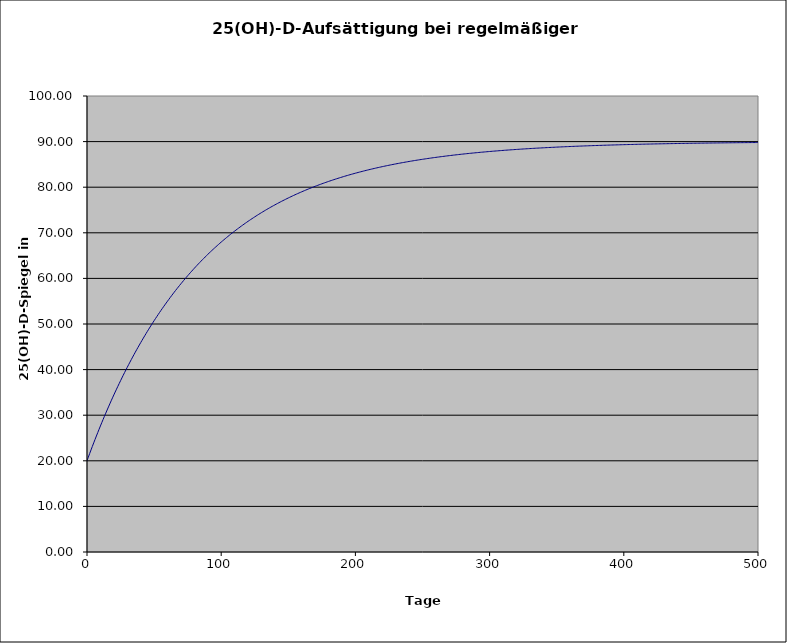
| Category | Series 0 |
|---|---|
| 0.0 | 20 |
| 1.0 | 20.804 |
| 2.0 | 21.599 |
| 3.0 | 22.385 |
| 4.0 | 23.162 |
| 5.0 | 23.93 |
| 6.0 | 24.689 |
| 7.0 | 25.439 |
| 8.0 | 26.181 |
| 9.0 | 26.914 |
| 10.0 | 27.639 |
| 11.0 | 28.355 |
| 12.0 | 29.064 |
| 13.0 | 29.764 |
| 14.0 | 30.456 |
| 15.0 | 31.14 |
| 16.0 | 31.816 |
| 17.0 | 32.485 |
| 18.0 | 33.145 |
| 19.0 | 33.799 |
| 20.0 | 34.444 |
| 21.0 | 35.083 |
| 22.0 | 35.714 |
| 23.0 | 36.337 |
| 24.0 | 36.954 |
| 25.0 | 37.563 |
| 26.0 | 38.166 |
| 27.0 | 38.761 |
| 28.0 | 39.35 |
| 29.0 | 39.932 |
| 30.0 | 40.507 |
| 31.0 | 41.076 |
| 32.0 | 41.638 |
| 33.0 | 42.194 |
| 34.0 | 42.743 |
| 35.0 | 43.286 |
| 36.0 | 43.823 |
| 37.0 | 44.353 |
| 38.0 | 44.878 |
| 39.0 | 45.396 |
| 40.0 | 45.909 |
| 41.0 | 46.416 |
| 42.0 | 46.916 |
| 43.0 | 47.411 |
| 44.0 | 47.901 |
| 45.0 | 48.385 |
| 46.0 | 48.863 |
| 47.0 | 49.335 |
| 48.0 | 49.803 |
| 49.0 | 50.265 |
| 50.0 | 50.721 |
| 51.0 | 51.173 |
| 52.0 | 51.619 |
| 53.0 | 52.06 |
| 54.0 | 52.496 |
| 55.0 | 52.927 |
| 56.0 | 53.353 |
| 57.0 | 53.774 |
| 58.0 | 54.19 |
| 59.0 | 54.602 |
| 60.0 | 55.008 |
| 61.0 | 55.41 |
| 62.0 | 55.808 |
| 63.0 | 56.201 |
| 64.0 | 56.589 |
| 65.0 | 56.973 |
| 66.0 | 57.353 |
| 67.0 | 57.728 |
| 68.0 | 58.099 |
| 69.0 | 58.465 |
| 70.0 | 58.828 |
| 71.0 | 59.186 |
| 72.0 | 59.54 |
| 73.0 | 59.89 |
| 74.0 | 60.236 |
| 75.0 | 60.578 |
| 76.0 | 60.916 |
| 77.0 | 61.251 |
| 78.0 | 61.581 |
| 79.0 | 61.908 |
| 80.0 | 62.231 |
| 81.0 | 62.55 |
| 82.0 | 62.865 |
| 83.0 | 63.177 |
| 84.0 | 63.485 |
| 85.0 | 63.79 |
| 86.0 | 64.091 |
| 87.0 | 64.389 |
| 88.0 | 64.683 |
| 89.0 | 64.974 |
| 90.0 | 65.262 |
| 91.0 | 65.546 |
| 92.0 | 65.827 |
| 93.0 | 66.105 |
| 94.0 | 66.38 |
| 95.0 | 66.651 |
| 96.0 | 66.92 |
| 97.0 | 67.185 |
| 98.0 | 67.447 |
| 99.0 | 67.707 |
| 100.0 | 67.963 |
| 101.0 | 68.216 |
| 102.0 | 68.467 |
| 103.0 | 68.714 |
| 104.0 | 68.959 |
| 105.0 | 69.201 |
| 106.0 | 69.44 |
| 107.0 | 69.676 |
| 108.0 | 69.91 |
| 109.0 | 70.141 |
| 110.0 | 70.369 |
| 111.0 | 70.595 |
| 112.0 | 70.818 |
| 113.0 | 71.038 |
| 114.0 | 71.256 |
| 115.0 | 71.472 |
| 116.0 | 71.685 |
| 117.0 | 71.895 |
| 118.0 | 72.103 |
| 119.0 | 72.309 |
| 120.0 | 72.513 |
| 121.0 | 72.714 |
| 122.0 | 72.912 |
| 123.0 | 73.109 |
| 124.0 | 73.303 |
| 125.0 | 73.495 |
| 126.0 | 73.685 |
| 127.0 | 73.872 |
| 128.0 | 74.058 |
| 129.0 | 74.241 |
| 130.0 | 74.422 |
| 131.0 | 74.601 |
| 132.0 | 74.778 |
| 133.0 | 74.953 |
| 134.0 | 75.126 |
| 135.0 | 75.298 |
| 136.0 | 75.467 |
| 137.0 | 75.634 |
| 138.0 | 75.799 |
| 139.0 | 75.962 |
| 140.0 | 76.124 |
| 141.0 | 76.283 |
| 142.0 | 76.441 |
| 143.0 | 76.597 |
| 144.0 | 76.751 |
| 145.0 | 76.903 |
| 146.0 | 77.054 |
| 147.0 | 77.203 |
| 148.0 | 77.35 |
| 149.0 | 77.496 |
| 150.0 | 77.639 |
| 151.0 | 77.782 |
| 152.0 | 77.922 |
| 153.0 | 78.061 |
| 154.0 | 78.198 |
| 155.0 | 78.334 |
| 156.0 | 78.468 |
| 157.0 | 78.601 |
| 158.0 | 78.732 |
| 159.0 | 78.862 |
| 160.0 | 78.99 |
| 161.0 | 79.116 |
| 162.0 | 79.242 |
| 163.0 | 79.365 |
| 164.0 | 79.488 |
| 165.0 | 79.609 |
| 166.0 | 79.728 |
| 167.0 | 79.846 |
| 168.0 | 79.963 |
| 169.0 | 80.079 |
| 170.0 | 80.193 |
| 171.0 | 80.306 |
| 172.0 | 80.417 |
| 173.0 | 80.527 |
| 174.0 | 80.636 |
| 175.0 | 80.744 |
| 176.0 | 80.851 |
| 177.0 | 80.956 |
| 178.0 | 81.06 |
| 179.0 | 81.163 |
| 180.0 | 81.265 |
| 181.0 | 81.365 |
| 182.0 | 81.465 |
| 183.0 | 81.563 |
| 184.0 | 81.66 |
| 185.0 | 81.756 |
| 186.0 | 81.851 |
| 187.0 | 81.945 |
| 188.0 | 82.037 |
| 189.0 | 82.129 |
| 190.0 | 82.219 |
| 191.0 | 82.309 |
| 192.0 | 82.398 |
| 193.0 | 82.485 |
| 194.0 | 82.572 |
| 195.0 | 82.657 |
| 196.0 | 82.742 |
| 197.0 | 82.825 |
| 198.0 | 82.908 |
| 199.0 | 82.989 |
| 200.0 | 83.07 |
| 201.0 | 83.15 |
| 202.0 | 83.229 |
| 203.0 | 83.307 |
| 204.0 | 83.384 |
| 205.0 | 83.46 |
| 206.0 | 83.535 |
| 207.0 | 83.61 |
| 208.0 | 83.683 |
| 209.0 | 83.756 |
| 210.0 | 83.828 |
| 211.0 | 83.899 |
| 212.0 | 83.969 |
| 213.0 | 84.039 |
| 214.0 | 84.108 |
| 215.0 | 84.175 |
| 216.0 | 84.242 |
| 217.0 | 84.309 |
| 218.0 | 84.374 |
| 219.0 | 84.439 |
| 220.0 | 84.503 |
| 221.0 | 84.567 |
| 222.0 | 84.629 |
| 223.0 | 84.691 |
| 224.0 | 84.752 |
| 225.0 | 84.813 |
| 226.0 | 84.872 |
| 227.0 | 84.932 |
| 228.0 | 84.99 |
| 229.0 | 85.048 |
| 230.0 | 85.105 |
| 231.0 | 85.161 |
| 232.0 | 85.217 |
| 233.0 | 85.272 |
| 234.0 | 85.327 |
| 235.0 | 85.38 |
| 236.0 | 85.434 |
| 237.0 | 85.486 |
| 238.0 | 85.538 |
| 239.0 | 85.59 |
| 240.0 | 85.641 |
| 241.0 | 85.691 |
| 242.0 | 85.741 |
| 243.0 | 85.79 |
| 244.0 | 85.838 |
| 245.0 | 85.886 |
| 246.0 | 85.934 |
| 247.0 | 85.981 |
| 248.0 | 86.027 |
| 249.0 | 86.073 |
| 250.0 | 86.118 |
| 251.0 | 86.163 |
| 252.0 | 86.207 |
| 253.0 | 86.251 |
| 254.0 | 86.294 |
| 255.0 | 86.337 |
| 256.0 | 86.379 |
| 257.0 | 86.421 |
| 258.0 | 86.462 |
| 259.0 | 86.503 |
| 260.0 | 86.543 |
| 261.0 | 86.583 |
| 262.0 | 86.623 |
| 263.0 | 86.662 |
| 264.0 | 86.7 |
| 265.0 | 86.738 |
| 266.0 | 86.776 |
| 267.0 | 86.813 |
| 268.0 | 86.85 |
| 269.0 | 86.886 |
| 270.0 | 86.922 |
| 271.0 | 86.958 |
| 272.0 | 86.993 |
| 273.0 | 87.028 |
| 274.0 | 87.062 |
| 275.0 | 87.096 |
| 276.0 | 87.13 |
| 277.0 | 87.163 |
| 278.0 | 87.196 |
| 279.0 | 87.228 |
| 280.0 | 87.26 |
| 281.0 | 87.292 |
| 282.0 | 87.323 |
| 283.0 | 87.354 |
| 284.0 | 87.384 |
| 285.0 | 87.415 |
| 286.0 | 87.445 |
| 287.0 | 87.474 |
| 288.0 | 87.503 |
| 289.0 | 87.532 |
| 290.0 | 87.561 |
| 291.0 | 87.589 |
| 292.0 | 87.617 |
| 293.0 | 87.644 |
| 294.0 | 87.672 |
| 295.0 | 87.699 |
| 296.0 | 87.725 |
| 297.0 | 87.752 |
| 298.0 | 87.778 |
| 299.0 | 87.803 |
| 300.0 | 87.829 |
| 301.0 | 87.854 |
| 302.0 | 87.879 |
| 303.0 | 87.903 |
| 304.0 | 87.928 |
| 305.0 | 87.952 |
| 306.0 | 87.975 |
| 307.0 | 87.999 |
| 308.0 | 88.022 |
| 309.0 | 88.045 |
| 310.0 | 88.067 |
| 311.0 | 88.09 |
| 312.0 | 88.112 |
| 313.0 | 88.134 |
| 314.0 | 88.155 |
| 315.0 | 88.177 |
| 316.0 | 88.198 |
| 317.0 | 88.219 |
| 318.0 | 88.239 |
| 319.0 | 88.26 |
| 320.0 | 88.28 |
| 321.0 | 88.3 |
| 322.0 | 88.32 |
| 323.0 | 88.339 |
| 324.0 | 88.359 |
| 325.0 | 88.378 |
| 326.0 | 88.396 |
| 327.0 | 88.415 |
| 328.0 | 88.433 |
| 329.0 | 88.452 |
| 330.0 | 88.47 |
| 331.0 | 88.487 |
| 332.0 | 88.505 |
| 333.0 | 88.522 |
| 334.0 | 88.539 |
| 335.0 | 88.556 |
| 336.0 | 88.573 |
| 337.0 | 88.59 |
| 338.0 | 88.606 |
| 339.0 | 88.622 |
| 340.0 | 88.638 |
| 341.0 | 88.654 |
| 342.0 | 88.67 |
| 343.0 | 88.685 |
| 344.0 | 88.701 |
| 345.0 | 88.716 |
| 346.0 | 88.731 |
| 347.0 | 88.745 |
| 348.0 | 88.76 |
| 349.0 | 88.774 |
| 350.0 | 88.789 |
| 351.0 | 88.803 |
| 352.0 | 88.817 |
| 353.0 | 88.831 |
| 354.0 | 88.844 |
| 355.0 | 88.858 |
| 356.0 | 88.871 |
| 357.0 | 88.884 |
| 358.0 | 88.897 |
| 359.0 | 88.91 |
| 360.0 | 88.923 |
| 361.0 | 88.935 |
| 362.0 | 88.948 |
| 363.0 | 88.96 |
| 364.0 | 88.972 |
| 365.0 | 88.984 |
| 366.0 | 88.996 |
| 367.0 | 89.008 |
| 368.0 | 89.019 |
| 369.0 | 89.031 |
| 370.0 | 89.042 |
| 371.0 | 89.053 |
| 372.0 | 89.064 |
| 373.0 | 89.075 |
| 374.0 | 89.086 |
| 375.0 | 89.097 |
| 376.0 | 89.107 |
| 377.0 | 89.118 |
| 378.0 | 89.128 |
| 379.0 | 89.138 |
| 380.0 | 89.148 |
| 381.0 | 89.158 |
| 382.0 | 89.168 |
| 383.0 | 89.178 |
| 384.0 | 89.188 |
| 385.0 | 89.197 |
| 386.0 | 89.207 |
| 387.0 | 89.216 |
| 388.0 | 89.225 |
| 389.0 | 89.234 |
| 390.0 | 89.243 |
| 391.0 | 89.252 |
| 392.0 | 89.261 |
| 393.0 | 89.269 |
| 394.0 | 89.278 |
| 395.0 | 89.287 |
| 396.0 | 89.295 |
| 397.0 | 89.303 |
| 398.0 | 89.311 |
| 399.0 | 89.32 |
| 400.0 | 89.328 |
| 401.0 | 89.335 |
| 402.0 | 89.343 |
| 403.0 | 89.351 |
| 404.0 | 89.359 |
| 405.0 | 89.366 |
| 406.0 | 89.374 |
| 407.0 | 89.381 |
| 408.0 | 89.388 |
| 409.0 | 89.396 |
| 410.0 | 89.403 |
| 411.0 | 89.41 |
| 412.0 | 89.417 |
| 413.0 | 89.424 |
| 414.0 | 89.43 |
| 415.0 | 89.437 |
| 416.0 | 89.444 |
| 417.0 | 89.45 |
| 418.0 | 89.457 |
| 419.0 | 89.463 |
| 420.0 | 89.47 |
| 421.0 | 89.476 |
| 422.0 | 89.482 |
| 423.0 | 89.488 |
| 424.0 | 89.494 |
| 425.0 | 89.5 |
| 426.0 | 89.506 |
| 427.0 | 89.512 |
| 428.0 | 89.518 |
| 429.0 | 89.524 |
| 430.0 | 89.529 |
| 431.0 | 89.535 |
| 432.0 | 89.541 |
| 433.0 | 89.546 |
| 434.0 | 89.551 |
| 435.0 | 89.557 |
| 436.0 | 89.562 |
| 437.0 | 89.567 |
| 438.0 | 89.572 |
| 439.0 | 89.578 |
| 440.0 | 89.583 |
| 441.0 | 89.588 |
| 442.0 | 89.592 |
| 443.0 | 89.597 |
| 444.0 | 89.602 |
| 445.0 | 89.607 |
| 446.0 | 89.612 |
| 447.0 | 89.616 |
| 448.0 | 89.621 |
| 449.0 | 89.625 |
| 450.0 | 89.63 |
| 451.0 | 89.634 |
| 452.0 | 89.639 |
| 453.0 | 89.643 |
| 454.0 | 89.647 |
| 455.0 | 89.652 |
| 456.0 | 89.656 |
| 457.0 | 89.66 |
| 458.0 | 89.664 |
| 459.0 | 89.668 |
| 460.0 | 89.672 |
| 461.0 | 89.676 |
| 462.0 | 89.68 |
| 463.0 | 89.684 |
| 464.0 | 89.688 |
| 465.0 | 89.691 |
| 466.0 | 89.695 |
| 467.0 | 89.699 |
| 468.0 | 89.703 |
| 469.0 | 89.706 |
| 470.0 | 89.71 |
| 471.0 | 89.713 |
| 472.0 | 89.717 |
| 473.0 | 89.72 |
| 474.0 | 89.724 |
| 475.0 | 89.727 |
| 476.0 | 89.73 |
| 477.0 | 89.734 |
| 478.0 | 89.737 |
| 479.0 | 89.74 |
| 480.0 | 89.743 |
| 481.0 | 89.746 |
| 482.0 | 89.749 |
| 483.0 | 89.753 |
| 484.0 | 89.756 |
| 485.0 | 89.759 |
| 486.0 | 89.762 |
| 487.0 | 89.764 |
| 488.0 | 89.767 |
| 489.0 | 89.77 |
| 490.0 | 89.773 |
| 491.0 | 89.776 |
| 492.0 | 89.779 |
| 493.0 | 89.781 |
| 494.0 | 89.784 |
| 495.0 | 89.787 |
| 496.0 | 89.789 |
| 497.0 | 89.792 |
| 498.0 | 89.795 |
| 499.0 | 89.797 |
| 500.0 | 89.8 |